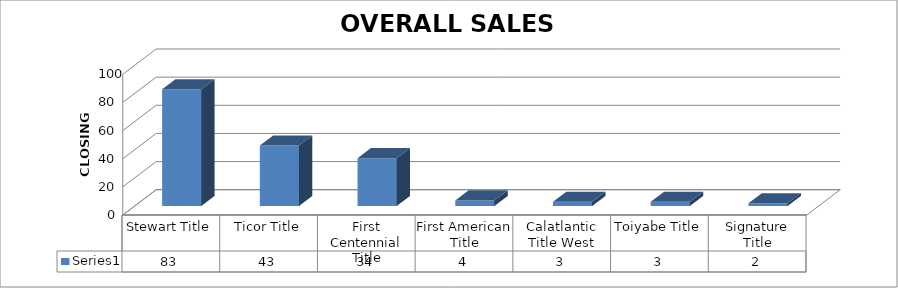
| Category | Series 0 |
|---|---|
| Stewart Title | 83 |
| Ticor Title | 43 |
| First Centennial Title | 34 |
| First American Title | 4 |
| Calatlantic Title West | 3 |
| Toiyabe Title | 3 |
| Signature Title | 2 |